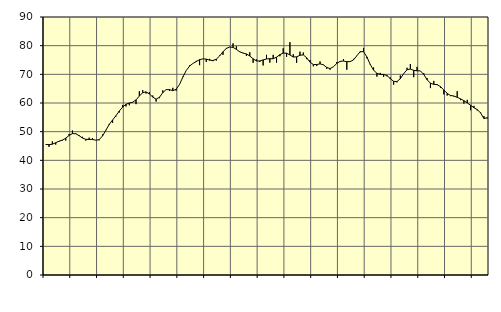
| Category | Piggar | Series 1 |
|---|---|---|
| nan | 45.5 | 45.55 |
| 87.0 | 44.7 | 45.47 |
| 87.0 | 46.6 | 45.63 |
| 87.0 | 45.5 | 46.15 |
| nan | 46.5 | 46.67 |
| 88.0 | 46.9 | 47.06 |
| 88.0 | 46.9 | 47.72 |
| 88.0 | 49.2 | 48.69 |
| nan | 50.4 | 49.32 |
| 89.0 | 49.4 | 49.28 |
| 89.0 | 48.8 | 48.59 |
| 89.0 | 48.2 | 47.78 |
| nan | 46.9 | 47.32 |
| 90.0 | 47.9 | 47.29 |
| 90.0 | 47.8 | 47.3 |
| 90.0 | 47 | 47.02 |
| nan | 47 | 47.22 |
| 91.0 | 49 | 48.52 |
| 91.0 | 50.6 | 50.51 |
| 91.0 | 52.3 | 52.54 |
| nan | 53.1 | 54.08 |
| 92.0 | 55.3 | 55.55 |
| 92.0 | 56.7 | 57.19 |
| 92.0 | 59.3 | 58.56 |
| nan | 58.8 | 59.55 |
| 93.0 | 59.2 | 60 |
| 93.0 | 60.2 | 60.27 |
| 93.0 | 59.6 | 61.09 |
| nan | 64.1 | 62.43 |
| 94.0 | 64.5 | 63.61 |
| 94.0 | 63.3 | 63.88 |
| 94.0 | 63.8 | 63.16 |
| nan | 62.6 | 62.07 |
| 95.0 | 60.5 | 61.34 |
| 95.0 | 61.7 | 62 |
| 95.0 | 64.4 | 63.6 |
| nan | 64.7 | 64.67 |
| 96.0 | 64.2 | 64.66 |
| 96.0 | 65.3 | 64.29 |
| 96.0 | 64.3 | 64.79 |
| nan | 66.5 | 66.45 |
| 97.0 | 69.2 | 69.02 |
| 97.0 | 71.3 | 71.32 |
| 97.0 | 73.1 | 72.86 |
| nan | 73.8 | 73.79 |
| 98.0 | 74.7 | 74.46 |
| 98.0 | 73.2 | 75.12 |
| 98.0 | 75.4 | 75.4 |
| nan | 74.3 | 75.31 |
| 99.0 | 75.4 | 74.95 |
| 99.0 | 74.6 | 74.82 |
| 99.0 | 74.8 | 75.31 |
| nan | 76.6 | 76.42 |
| 0.0 | 76.8 | 77.88 |
| 0.0 | 79.2 | 79.02 |
| 0.0 | 79.6 | 79.53 |
| nan | 80.8 | 79.4 |
| 1.0 | 79.8 | 78.71 |
| 1.0 | 78 | 77.85 |
| 1.0 | 77.5 | 77.41 |
| nan | 76.4 | 77.12 |
| 2.0 | 77.7 | 76.4 |
| 2.0 | 74 | 75.42 |
| 2.0 | 75.2 | 74.67 |
| nan | 74.3 | 74.66 |
| 3.0 | 73.1 | 75.03 |
| 3.0 | 76.8 | 75.36 |
| 3.0 | 74.1 | 75.46 |
| nan | 76.8 | 75.44 |
| 4.0 | 74.1 | 75.99 |
| 4.0 | 76.3 | 76.87 |
| 4.0 | 79.1 | 77.4 |
| nan | 76.1 | 77.39 |
| 5.0 | 81.2 | 76.76 |
| 5.0 | 77 | 76.04 |
| 5.0 | 74 | 76.1 |
| nan | 77.9 | 76.65 |
| 6.0 | 77.6 | 76.78 |
| 6.0 | 75.3 | 75.78 |
| 6.0 | 75 | 74.25 |
| nan | 72.8 | 73.42 |
| 7.0 | 72.9 | 73.4 |
| 7.0 | 74.5 | 73.66 |
| 7.0 | 73.4 | 73.3 |
| nan | 71.9 | 72.41 |
| 8.0 | 71.6 | 72.01 |
| 8.0 | 72.7 | 72.65 |
| 8.0 | 74.3 | 73.78 |
| nan | 74.4 | 74.53 |
| 9.0 | 75.3 | 74.63 |
| 9.0 | 71.6 | 74.42 |
| 9.0 | 74.6 | 74.44 |
| nan | 75.4 | 75.03 |
| 10.0 | 76.4 | 76.47 |
| 10.0 | 77.7 | 77.9 |
| 10.0 | 79.2 | 77.93 |
| nan | 75.6 | 76.07 |
| 11.0 | 73.6 | 73.46 |
| 11.0 | 72.4 | 71.44 |
| 11.0 | 69.2 | 70.37 |
| nan | 70.5 | 69.97 |
| 12.0 | 69.1 | 69.96 |
| 12.0 | 69.3 | 69.6 |
| 12.0 | 68.9 | 68.48 |
| nan | 66.4 | 67.55 |
| 13.0 | 67.2 | 67.48 |
| 13.0 | 69.6 | 68.47 |
| 13.0 | 70.2 | 70.24 |
| nan | 72.3 | 71.6 |
| 14.0 | 73.6 | 71.84 |
| 14.0 | 69 | 71.38 |
| 14.0 | 72.6 | 71.24 |
| nan | 71.2 | 71.19 |
| 15.0 | 70.4 | 69.98 |
| 15.0 | 68.7 | 68.1 |
| 15.0 | 65.2 | 66.9 |
| nan | 67.7 | 66.5 |
| 16.0 | 66.6 | 66.41 |
| 16.0 | 65.3 | 65.71 |
| 16.0 | 63 | 64.53 |
| nan | 62.6 | 63.36 |
| 17.0 | 62.4 | 62.62 |
| 17.0 | 62.3 | 62.44 |
| 17.0 | 64.1 | 61.97 |
| nan | 61 | 61.44 |
| 18.0 | 59.8 | 60.81 |
| 18.0 | 61.1 | 60.02 |
| 18.0 | 57.5 | 59.22 |
| nan | 59 | 58.34 |
| 19.0 | 57.4 | 57.69 |
| 19.0 | 56.7 | 56.52 |
| 19.0 | 55.4 | 54.56 |
| nan | 54.6 | 54.89 |